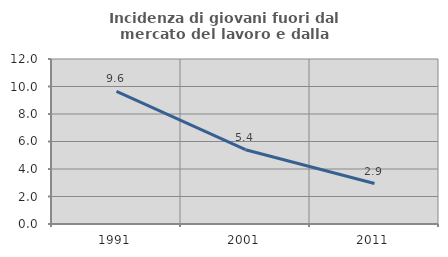
| Category | Incidenza di giovani fuori dal mercato del lavoro e dalla formazione  |
|---|---|
| 1991.0 | 9.649 |
| 2001.0 | 5.405 |
| 2011.0 | 2.941 |